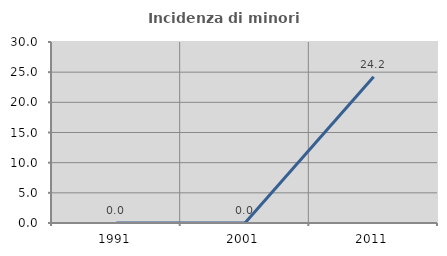
| Category | Incidenza di minori stranieri |
|---|---|
| 1991.0 | 0 |
| 2001.0 | 0 |
| 2011.0 | 24.242 |